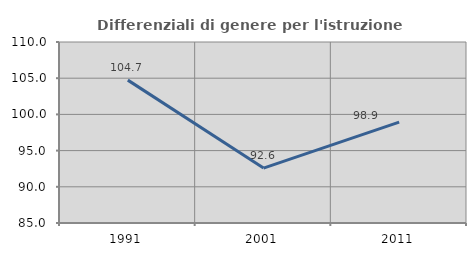
| Category | Differenziali di genere per l'istruzione superiore |
|---|---|
| 1991.0 | 104.734 |
| 2001.0 | 92.584 |
| 2011.0 | 98.927 |